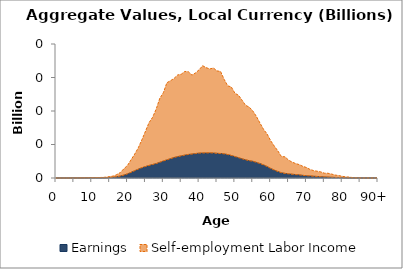
| Category | Earnings | Self-employment Labor Income |
|---|---|---|
| 0 | 0 | 0 |
|  | 0 | 0 |
| 2 | 0 | 0.01 |
| 3 | 0 | 0.035 |
| 4 | 0 | 0.045 |
| 5 | 0.015 | 0.045 |
| 6 | 0.08 | 0.044 |
| 7 | 0.133 | 0.063 |
| 8 | 0.2 | 0.134 |
| 9 | 0.261 | 0.132 |
| 10 | 0.33 | 0.179 |
| 11 | 0.341 | 0.186 |
| 12 | 0.357 | 0.357 |
| 13 | 0.363 | 0.509 |
| 14 | 0.467 | 0.803 |
| 15 | 0.748 | 1.464 |
| 16 | 1.163 | 1.705 |
| 17 | 1.918 | 3.187 |
| 18 | 2.976 | 5.255 |
| 19 | 4.43 | 9.511 |
| 20 | 6.179 | 12.636 |
| 21 | 8.513 | 18.866 |
| 22 | 10.871 | 24.814 |
| 23 | 13.252 | 31.855 |
| 24 | 15.388 | 41.586 |
| 25 | 17.127 | 52.501 |
| 26 | 18.715 | 63.854 |
| 27 | 20.14 | 70.483 |
| 28 | 21.547 | 81.239 |
| 29 | 23.467 | 95.262 |
| 30 | 25.41 | 101.894 |
| 31 | 27.12 | 115.114 |
| 32 | 28.848 | 116.359 |
| 33 | 30.611 | 117.975 |
| 34 | 31.916 | 121.853 |
| 35 | 33.029 | 121.832 |
| 36 | 34.188 | 124.872 |
| 37 | 35.146 | 123.444 |
| 38 | 35.766 | 117.797 |
| 39 | 36.516 | 120.329 |
| 40 | 37.133 | 124.425 |
| 41 | 37.348 | 130.26 |
| 42 | 37.433 | 127.146 |
| 43 | 37.485 | 125.319 |
| 44 | 37.322 | 126.848 |
| 45 | 36.85 | 123.002 |
| 46 | 36.581 | 122.395 |
| 47 | 36.023 | 111.202 |
| 48 | 35.022 | 102.528 |
| 49 | 33.62 | 102.265 |
| 50 | 32.019 | 94.545 |
| 51 | 30.344 | 93.157 |
| 52 | 28.664 | 87.501 |
| 53 | 27.174 | 81.257 |
| 54 | 25.848 | 80.021 |
| 55 | 25.05 | 75.104 |
| 56 | 23.352 | 68.703 |
| 57 | 21.617 | 60.528 |
| 58 | 19.639 | 53.071 |
| 59 | 17.162 | 48.55 |
| 60 | 14.301 | 41.4 |
| 61 | 11.835 | 35.861 |
| 62 | 9.7 | 30.865 |
| 63 | 7.86 | 24.191 |
| 64 | 6.91 | 24.706 |
| 65 | 6.166 | 20.557 |
| 66 | 5.639 | 18.061 |
| 67 | 5.08 | 16.493 |
| 68 | 4.677 | 15.28 |
| 69 | 3.957 | 13.457 |
| 70 | 3.436 | 12.203 |
| 71 | 3.03 | 9.757 |
| 72 | 2.658 | 8.41 |
| 73 | 2.3 | 7.789 |
| 74 | 2.012 | 7.103 |
| 75 | 1.722 | 5.446 |
| 76 | 1.393 | 5.701 |
| 77 | 1.124 | 4.784 |
| 78 | 0.907 | 3.505 |
| 79 | 0.71 | 2.931 |
| 80 | 0.533 | 2.012 |
| 81 | 0.387 | 1.285 |
| 82 | 0.252 | 1.103 |
| 83 | 0.151 | 0.368 |
| 84 | 0.08 | 0.172 |
| 85 | 0.03 | 0.126 |
| 86 | 0.011 | 0.07 |
| 87 | 0.004 | 0.062 |
| 88 | 0.001 | 0.038 |
| 89 | 0 | 0.008 |
| 90+ | 0 | 0.016 |